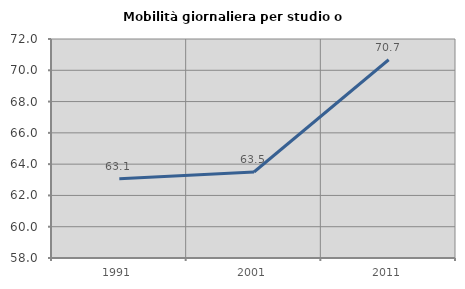
| Category | Mobilità giornaliera per studio o lavoro |
|---|---|
| 1991.0 | 63.071 |
| 2001.0 | 63.497 |
| 2011.0 | 70.673 |